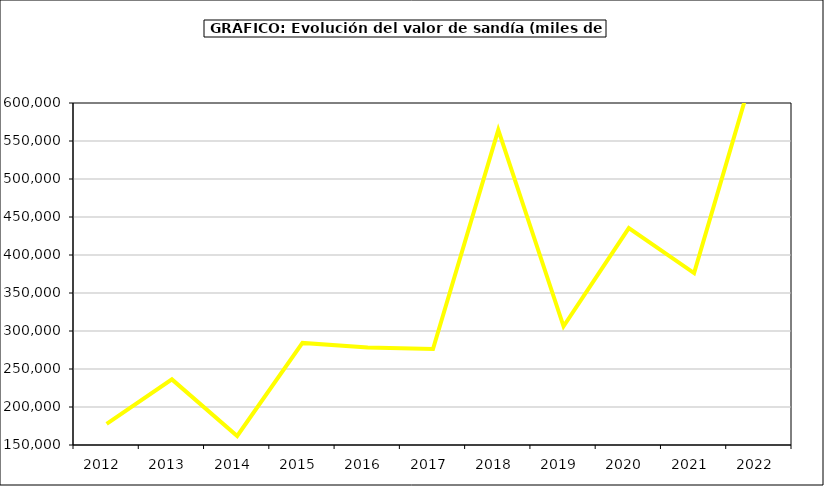
| Category | Valor |
|---|---|
| 2012.0 | 177750.096 |
| 2013.0 | 236329.828 |
| 2014.0 | 161950.328 |
| 2015.0 | 284357 |
| 2016.0 | 278370 |
| 2017.0 | 276294.254 |
| 2018.0 | 564662.077 |
| 2019.0 | 306143.724 |
| 2020.0 | 435408.11 |
| 2021.0 | 376256.072 |
| 2022.0 | 668587.187 |